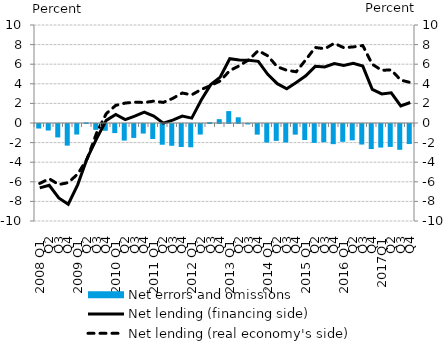
| Category | Net errors and omissions |
|---|---|
| 2008 Q1 | -0.462 |
| Q2 | -0.666 |
| Q3 | -1.371 |
| Q4 | -2.208 |
| 2009 Q1 | -1.075 |
| Q2 | 0.056 |
| Q3 | -0.595 |
| Q4 | -0.688 |
| 2010 Q1 | -0.929 |
| Q2 | -1.692 |
| Q3 | -1.42 |
| Q4 | -0.975 |
| 2011 Q1 | -1.533 |
| Q2 | -2.118 |
| Q3 | -2.221 |
| Q4 | -2.347 |
| 2012 Q1 | -2.376 |
| Q2 | -1.077 |
| Q3 | 0.091 |
| Q4 | 0.393 |
| 2013 Q1 | 1.215 |
| Q2 | 0.583 |
| Q3 | -0.044 |
| Q4 | -1.086 |
| 2014 Q1 | -1.893 |
| Q2 | -1.724 |
| Q3 | -1.889 |
| Q4 | -1.087 |
| 2015 Q1 | -1.635 |
| Q2 | -1.926 |
| Q3 | -1.86 |
| Q4 | -2.057 |
| 2016 Q1 | -1.82 |
| Q2 | -1.664 |
| Q3 | -2.098 |
| Q4 | -2.557 |
| 2017Q1 | -2.405 |
| Q2 | -2.339 |
| Q3 | -2.635 |
| Q4 | -2.047 |